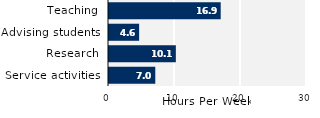
| Category | Series 0 |
|---|---|
| Service activities | 7.012 |
| Research | 10.128 |
| Advising students | 4.564 |
| Teaching | 16.923 |